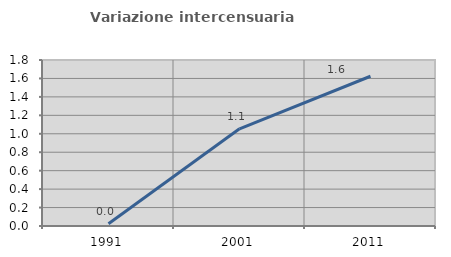
| Category | Variazione intercensuaria annua |
|---|---|
| 1991.0 | 0.025 |
| 2001.0 | 1.054 |
| 2011.0 | 1.624 |